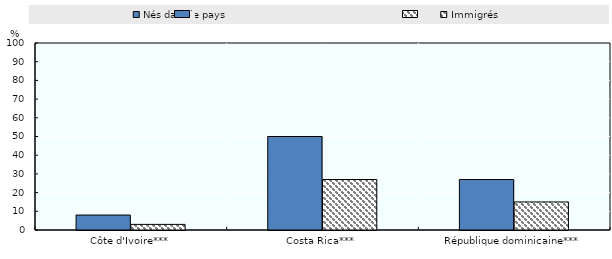
| Category | Nés dans le pays | Immigrés |
|---|---|---|
| Côte d'Ivoire*** | 8 | 3 |
| Costa Rica*** | 50 | 27 |
| République dominicaine*** | 27 | 15 |